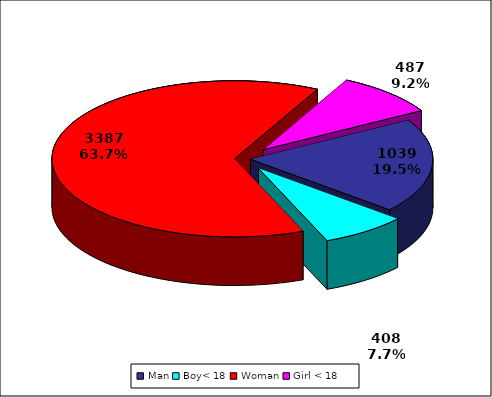
| Category | TOTAL |
|---|---|
| Man | 1039 |
| Boy< 18 | 408 |
| Woman | 3387 |
| Girl < 18 | 487 |